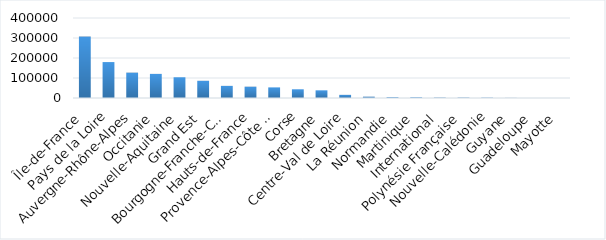
| Category | Île-de-France |
|---|---|
| Île-de-France | 307179.3 |
| Pays de la Loire | 179633.2 |
| Auvergne-Rhône-Alpes | 126723 |
| Occitanie | 120546 |
| Nouvelle-Aquitaine | 103710.8 |
| Grand Est | 85983 |
| Bourgogne-Franche-Comté | 60606.59 |
| Hauts-de-France | 56497.05 |
| Provence-Alpes-Côte d'Azur | 53078.12 |
| Corse | 43551 |
| Bretagne | 38394 |
| Centre-Val de Loire | 15696 |
| La Réunion | 6600 |
| Normandie | 4135 |
| Martinique | 3622 |
| International | 2000 |
| Polynésie Française | 2000 |
| Nouvelle-Calédonie | 1700 |
| Guyane | 600 |
| Guadeloupe | 0 |
| Mayotte | 0 |